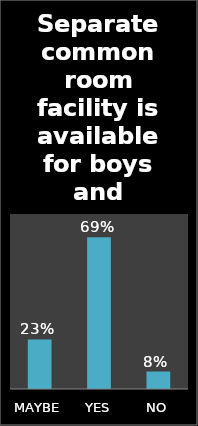
| Category | Series 0 |
|---|---|
| MAYBE | 0.227 |
| YES | 0.693 |
| NO | 0.08 |